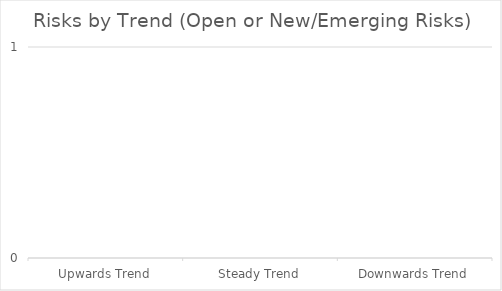
| Category | Residual Risks by Severity (Open or New/Emerging) |
|---|---|
| Upwards Trend | 0 |
| Steady Trend | 0 |
| Downwards Trend | 0 |